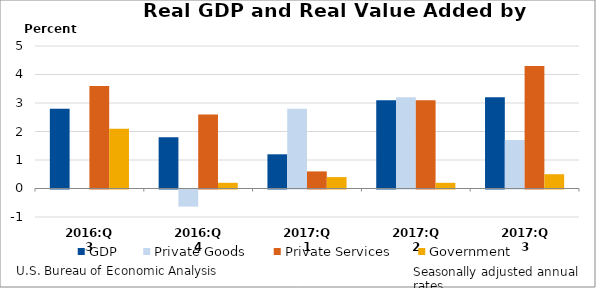
| Category | GDP | Private Goods | Private Services | Government |
|---|---|---|---|---|
| 2016:Q3 | 2.8 | 0 | 3.6 | 2.1 |
| 2016:Q4 | 1.8 | -0.6 | 2.6 | 0.2 |
| 2017:Q1 | 1.2 | 2.8 | 0.6 | 0.4 |
| 2017:Q2 | 3.1 | 3.2 | 3.1 | 0.2 |
| 2017:Q3 | 3.2 | 1.7 | 4.3 | 0.5 |